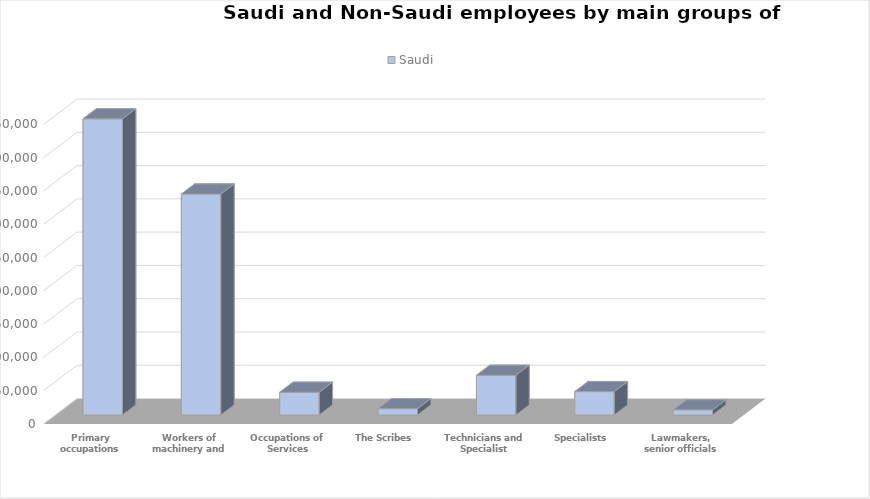
| Category | Saudi  |  Non-Saudi |
|---|---|---|
| Lawmakers, senior officials and managers | 7871 |  |
| Specialists | 35273 |  |
| Technicians and Specialist Assistants | 59778 |  |
| The Scribes | 9615 |  |
| Occupations of Services | 34278 |  |
| Workers of machinery and assembly workers | 332069 |  |
| Primary occupations | 445094 |  |